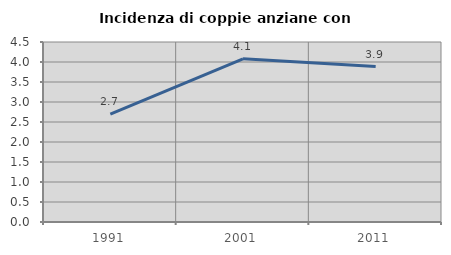
| Category | Incidenza di coppie anziane con figli |
|---|---|
| 1991.0 | 2.696 |
| 2001.0 | 4.08 |
| 2011.0 | 3.887 |